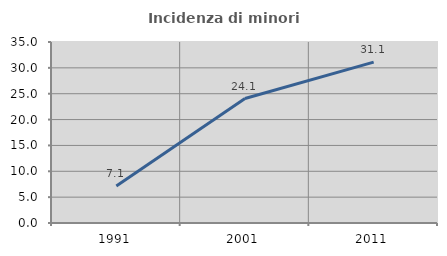
| Category | Incidenza di minori stranieri |
|---|---|
| 1991.0 | 7.143 |
| 2001.0 | 24.074 |
| 2011.0 | 31.118 |